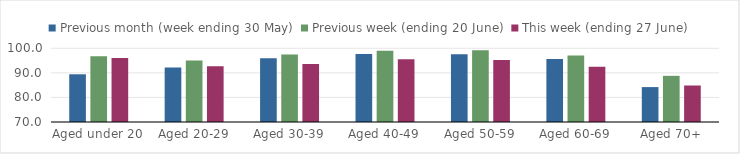
| Category | Previous month (week ending 30 May) | Previous week (ending 20 June) | This week (ending 27 June) |
|---|---|---|---|
| Aged under 20 | 89.422 | 96.728 | 96.001 |
| Aged 20-29 | 92.19 | 95 | 92.737 |
| Aged 30-39 | 95.901 | 97.423 | 93.574 |
| Aged 40-49 | 97.648 | 99.003 | 95.518 |
| Aged 50-59 | 97.61 | 99.211 | 95.249 |
| Aged 60-69 | 95.6 | 97.111 | 92.473 |
| Aged 70+ | 84.211 | 88.787 | 84.856 |